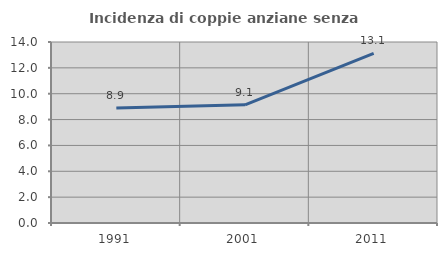
| Category | Incidenza di coppie anziane senza figli  |
|---|---|
| 1991.0 | 8.889 |
| 2001.0 | 9.139 |
| 2011.0 | 13.123 |